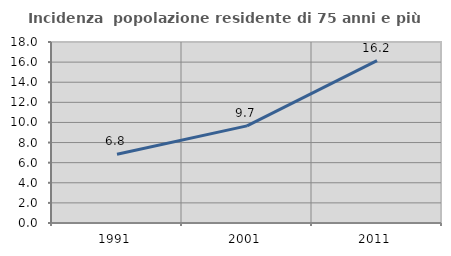
| Category | Incidenza  popolazione residente di 75 anni e più |
|---|---|
| 1991.0 | 6.832 |
| 2001.0 | 9.66 |
| 2011.0 | 16.154 |